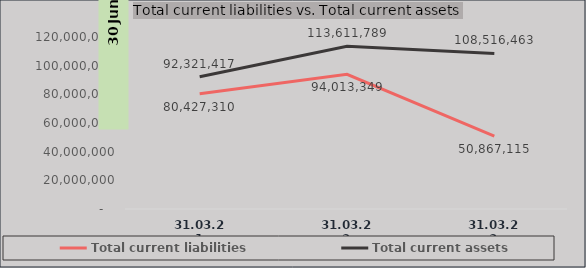
| Category | Total current liabilities | Total current assets |
|---|---|---|
| 31.03.21 | 80427310 | 92321417 |
| 31.03.22 | 94013349 | 113611789 |
| 31.03.23 | 50867115 | 108516463 |